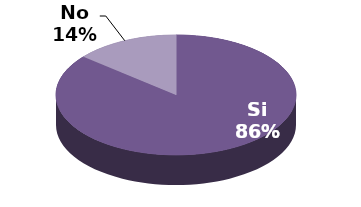
| Category | Series 1 |
|---|---|
| Si | 49 |
| No | 8 |